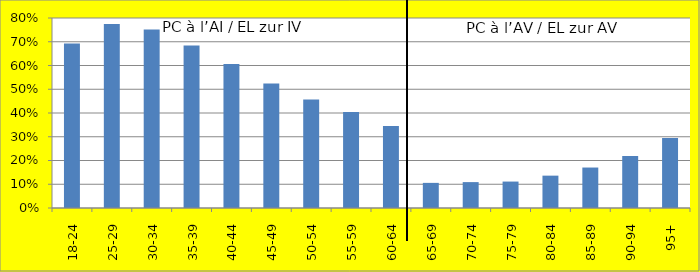
| Category | PC à l’AI / EL zur IV PC à l’AV / EL zur AV |
|---|---|
| 18-24 | 0.692 |
| 25-29 | 0.775 |
| 30-34 | 0.752 |
| 35-39 | 0.685 |
| 40-44 | 0.606 |
| 45-49 | 0.524 |
| 50-54 | 0.457 |
| 55-59 | 0.404 |
| 60-64 | 0.345 |
| 65-69 | 0.106 |
| 70-74 | 0.109 |
| 75-79 | 0.111 |
| 80-84 | 0.136 |
| 85-89 | 0.17 |
| 90-94 | 0.219 |
| 95+ | 0.294 |